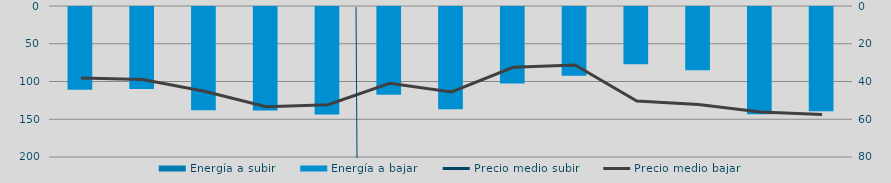
| Category | Energía a subir | Energía a bajar |
|---|---|---|
| D |  | 110.945 |
| E |  | 109.933 |
| F |  | 138.128 |
| M |  | 138.346 |
| A |  | 143.557 |
| M |  | 117.527 |
| J |  | 136.637 |
| J |  | 102.577 |
| A |  | 92.295 |
| S |  | 77.25 |
| O |  | 84.958 |
| N |  | 143.514 |
| D |  | 139.283 |